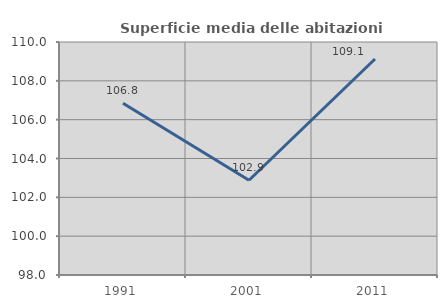
| Category | Superficie media delle abitazioni occupate |
|---|---|
| 1991.0 | 106.847 |
| 2001.0 | 102.881 |
| 2011.0 | 109.123 |